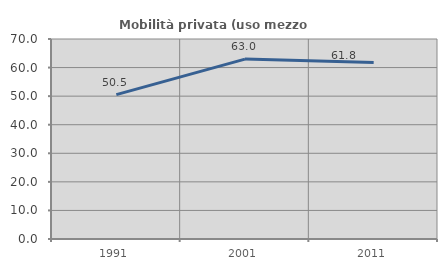
| Category | Mobilità privata (uso mezzo privato) |
|---|---|
| 1991.0 | 50.522 |
| 2001.0 | 62.966 |
| 2011.0 | 61.754 |